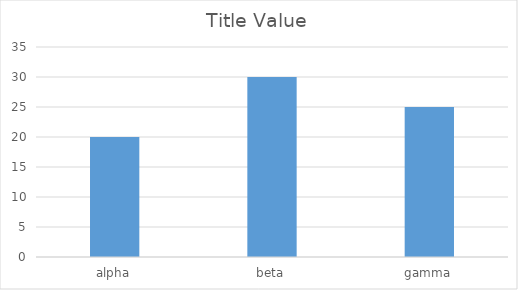
| Category | Title |
|---|---|
| alpha | 20 |
| beta | 30 |
| gamma | 25 |